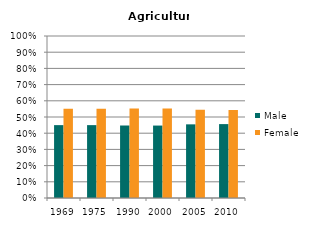
| Category | Male | Female |
|---|---|---|
| 1969.0 | 0.45 | 0.55 |
| 1975.0 | 0.45 | 0.55 |
| 1990.0 | 0.448 | 0.552 |
| 2000.0 | 0.447 | 0.553 |
| 2005.0 | 0.455 | 0.545 |
| 2010.0 | 0.456 | 0.544 |